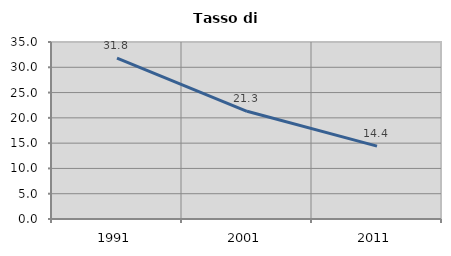
| Category | Tasso di disoccupazione   |
|---|---|
| 1991.0 | 31.831 |
| 2001.0 | 21.302 |
| 2011.0 | 14.414 |